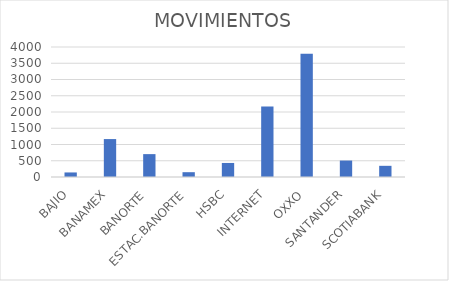
| Category | MOVIMIENTOS |
|---|---|
| BAJIO | 140 |
| BANAMEX | 1167 |
| BANORTE | 704 |
| ESTAC.BANORTE | 148 |
| HSBC | 432 |
| INTERNET | 2169 |
| OXXO | 3795 |
| SANTANDER | 506 |
| SCOTIABANK | 344 |